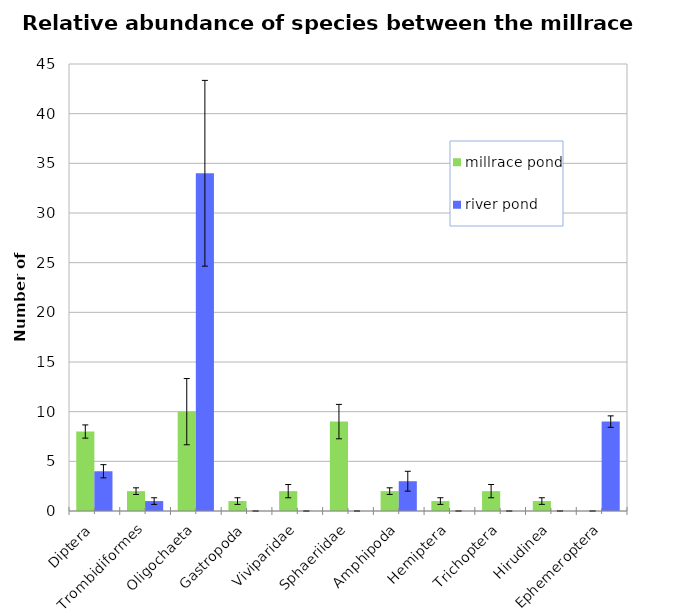
| Category | millrace pond | river pond |
|---|---|---|
| Diptera | 8 | 4 |
| Trombidiformes | 2 | 1 |
| Oligochaeta | 10 | 34 |
| Gastropoda | 1 | 0 |
| Viviparidae | 2 | 0 |
| Sphaeriidae | 9 | 0 |
| Amphipoda | 2 | 3 |
| Hemiptera | 1 | 0 |
| Trichoptera | 2 | 0 |
| Hirudinea | 1 | 0 |
| Ephemeroptera | 0 | 9 |